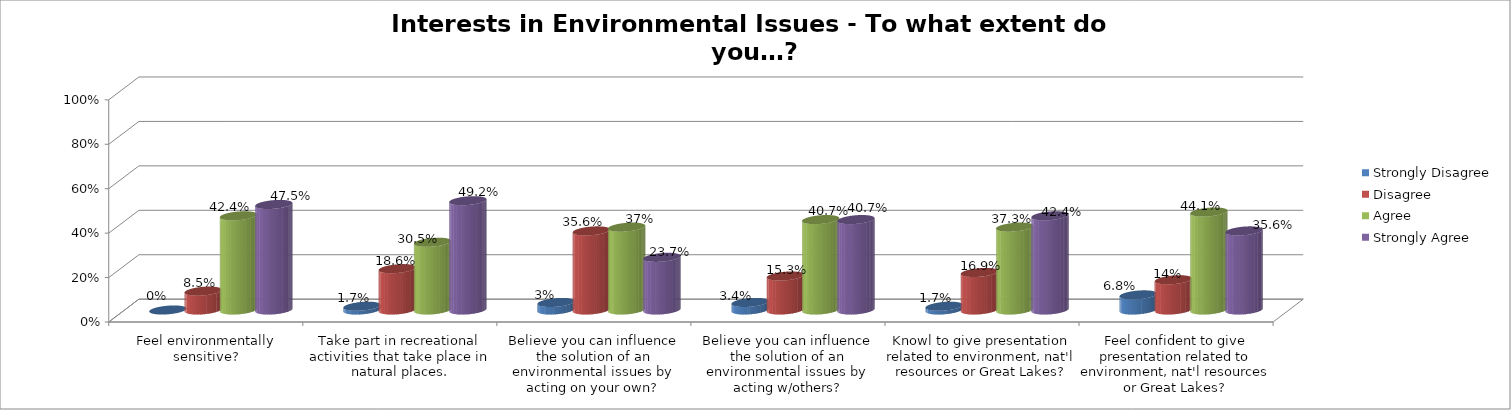
| Category | Strongly Disagree | Disagree | Agree | Strongly Agree |
|---|---|---|---|---|
| Feel environmentally sensitive? | 0 | 0.085 | 0.424 | 0.475 |
| Take part in recreational activities that take place in natural places. | 0.017 | 0.186 | 0.305 | 0.492 |
| Believe you can influence the solution of an environmental issues by acting on your own? | 0.034 | 0.356 | 0.373 | 0.237 |
| Believe you can influence the solution of an environmental issues by acting w/others? | 0.034 | 0.153 | 0.407 | 0.407 |
| Knowl to give presentation related to environment, nat'l resources or Great Lakes? | 0.017 | 0.169 | 0.373 | 0.424 |
| Feel confident to give presentation related to environment, nat'l resources or Great Lakes? | 0.068 | 0.136 | 0.441 | 0.356 |